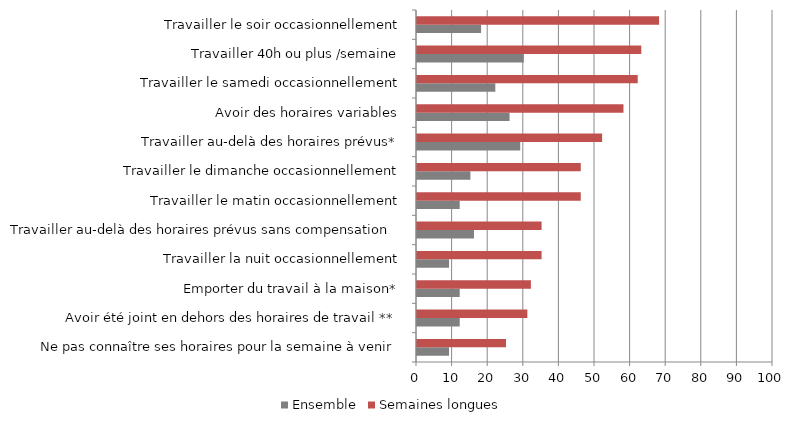
| Category | Ensemble | Semaines longues |
|---|---|---|
| Ne pas connaître ses horaires pour la semaine à venir | 9 | 25 |
| Avoir été joint en dehors des horaires de travail ** | 12 | 31 |
| Emporter du travail à la maison* | 12 | 32 |
| Travailler la nuit occasionnellement | 9 | 35 |
| Travailler au-delà des horaires prévus sans compensation  | 16 | 35 |
| Travailler le matin occasionnellement | 12 | 46 |
| Travailler le dimanche occasionnellement | 15 | 46 |
| Travailler au-delà des horaires prévus* | 29 | 52 |
| Avoir des horaires variables | 26 | 58 |
| Travailler le samedi occasionnellement | 22 | 62 |
| Travailler 40h ou plus /semaine | 30 | 63 |
| Travailler le soir occasionnellement | 18 | 68 |